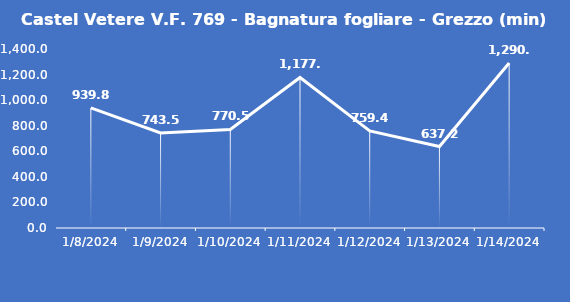
| Category | Castel Vetere V.F. 769 - Bagnatura fogliare - Grezzo (min) |
|---|---|
| 1/8/24 | 939.8 |
| 1/9/24 | 743.5 |
| 1/10/24 | 770.5 |
| 1/11/24 | 1177.3 |
| 1/12/24 | 759.4 |
| 1/13/24 | 637.2 |
| 1/14/24 | 1290.8 |